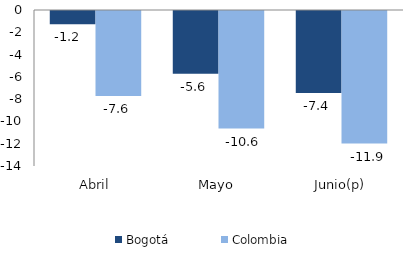
| Category | Bogotá | Colombia |
|---|---|---|
| Abril | -1.19 | -7.62 |
| Mayo | -5.633 | -10.55 |
| Junio(p) | -7.366 | -11.895 |